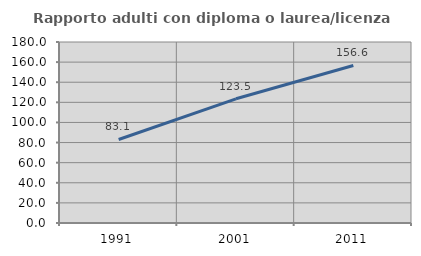
| Category | Rapporto adulti con diploma o laurea/licenza media  |
|---|---|
| 1991.0 | 83.078 |
| 2001.0 | 123.508 |
| 2011.0 | 156.63 |